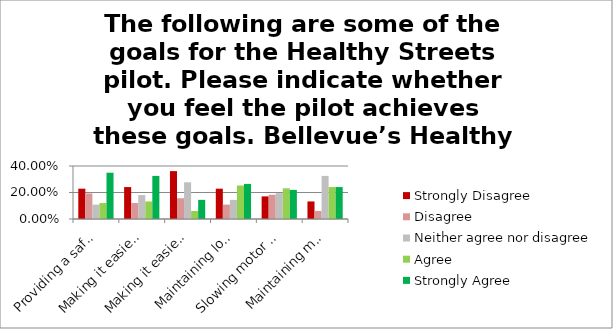
| Category | Strongly Disagree | Disagree | Neither agree nor disagree | Agree | Strongly Agree |
|---|---|---|---|---|---|
| Providing a safer space to walk/roll/bike in neighborhoods | 0.229 | 0.193 | 0.108 | 0.12 | 0.349 |
| Making it easier to practice physical distancing while being active during the COVID-19 crisis | 0.241 | 0.12 | 0.181 | 0.132 | 0.325 |
| Making it easier for people to reach local essential services | 0.361 | 0.157 | 0.277 | 0.06 | 0.145 |
| Maintaining local motor vehicle access for residents along the street | 0.229 | 0.108 | 0.145 | 0.253 | 0.265 |
| Slowing motor vehicle speeds along the street | 0.171 | 0.183 | 0.195 | 0.232 | 0.22 |
| Maintaining motor vehicle parking along the street | 0.132 | 0.06 | 0.325 | 0.241 | 0.241 |